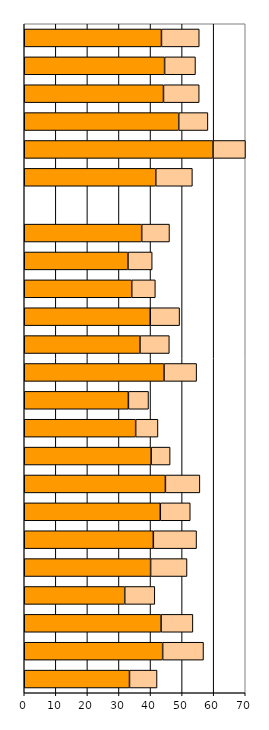
| Category | Series 0 | Series 1 |
|---|---|---|
| 0 | 33.336 | 8.726 |
| 1 | 43.841 | 12.937 |
| 2 | 43.331 | 10.086 |
| 3 | 31.826 | 9.524 |
| 4 | 40.02 | 11.531 |
| 5 | 40.889 | 13.687 |
| 6 | 43.089 | 9.494 |
| 7 | 44.706 | 10.918 |
| 8 | 40.192 | 6.013 |
| 9 | 35.289 | 7.058 |
| 10 | 32.985 | 6.375 |
| 11 | 44.27 | 10.327 |
| 12 | 36.652 | 9.298 |
| 13 | 39.909 | 9.293 |
| 14 | 34.041 | 7.481 |
| 15 | 32.847 | 7.672 |
| 16 | 37.198 | 8.799 |
| 17 | 0 | 0 |
| 18 | 41.657 | 11.598 |
| 19 | 59.79 | 10.272 |
| 20 | 48.928 | 9.242 |
| 21 | 44.098 | 11.316 |
| 22 | 44.456 | 9.772 |
| 23 | 43.462 | 11.964 |